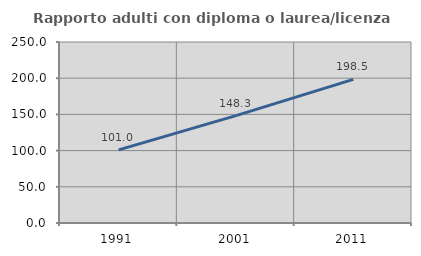
| Category | Rapporto adulti con diploma o laurea/licenza media  |
|---|---|
| 1991.0 | 100.971 |
| 2001.0 | 148.341 |
| 2011.0 | 198.462 |